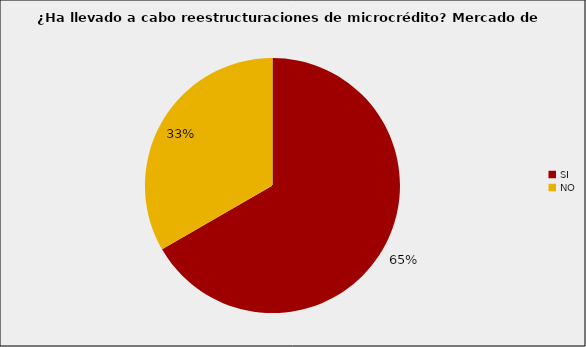
| Category | Mercado de Microcrédito |
|---|---|
| SI | 0.667 |
| NO | 0.333 |